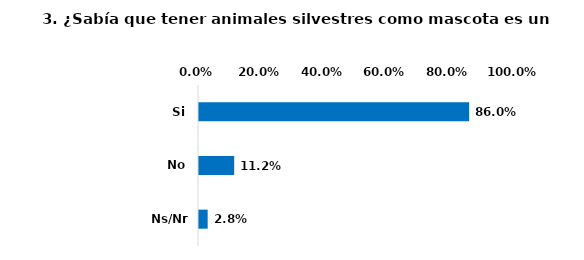
| Category | Series 0 |
|---|---|
| Si | 0.86 |
| No | 0.112 |
| Ns/Nr | 0.028 |